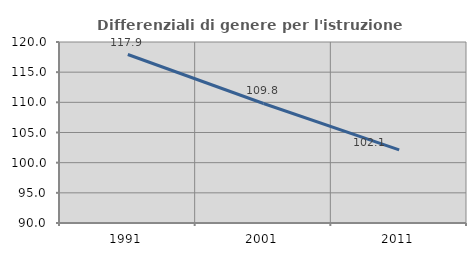
| Category | Differenziali di genere per l'istruzione superiore |
|---|---|
| 1991.0 | 117.925 |
| 2001.0 | 109.808 |
| 2011.0 | 102.122 |